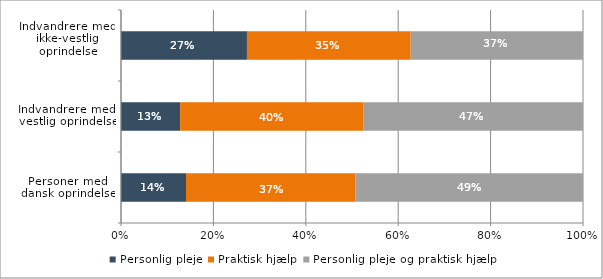
| Category | Personlig pleje | Praktisk hjælp | Personlig pleje og praktisk hjælp |
|---|---|---|---|
| Personer med 
dansk oprindelse | 0.141 | 0.367 | 0.492 |
| Indvandrere med
 vestlig oprindelse | 0.128 | 0.397 | 0.475 |
| Indvandrere med 
ikke-vestlig oprindelse | 0.273 | 0.354 | 0.373 |